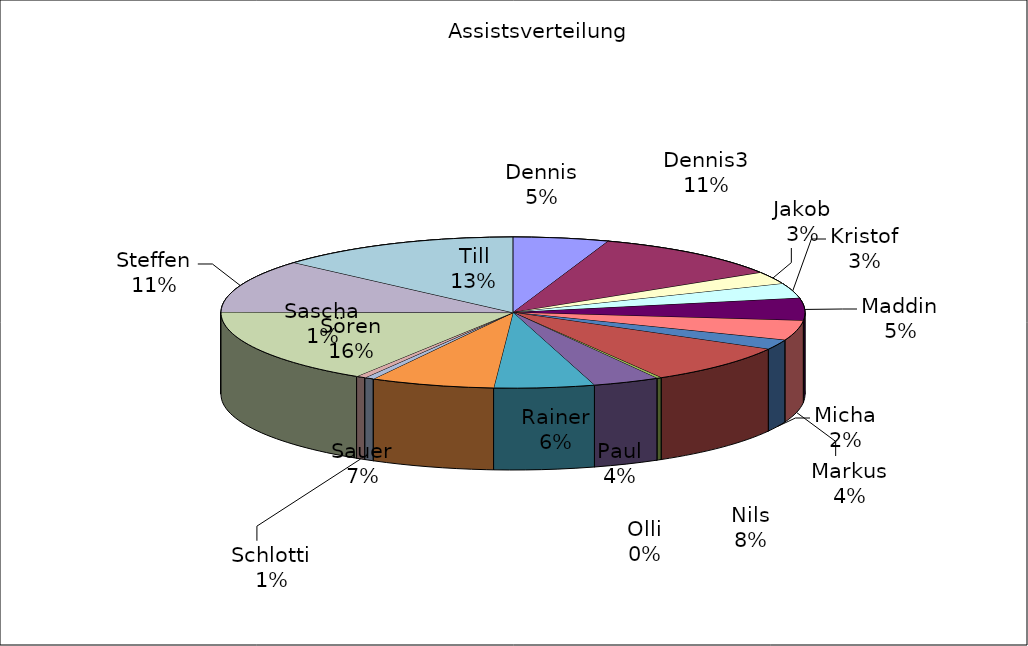
| Category | Series 0 |
|---|---|
| Dennis | 20 |
| Dennis3 | 41 |
| Jakob | 10 |
| Kristof | 12 |
| Maddin | 18 |
| Markus | 16 |
| Micha | 8 |
| Nils | 32 |
| Olli | 1 |
| Paul | 14 |
| Rainer | 21 |
| Sauer | 26 |
| Sascha | 2 |
| Schlotti | 2 |
| Sören | 61 |
| Steffen | 43 |
| Till | 51 |